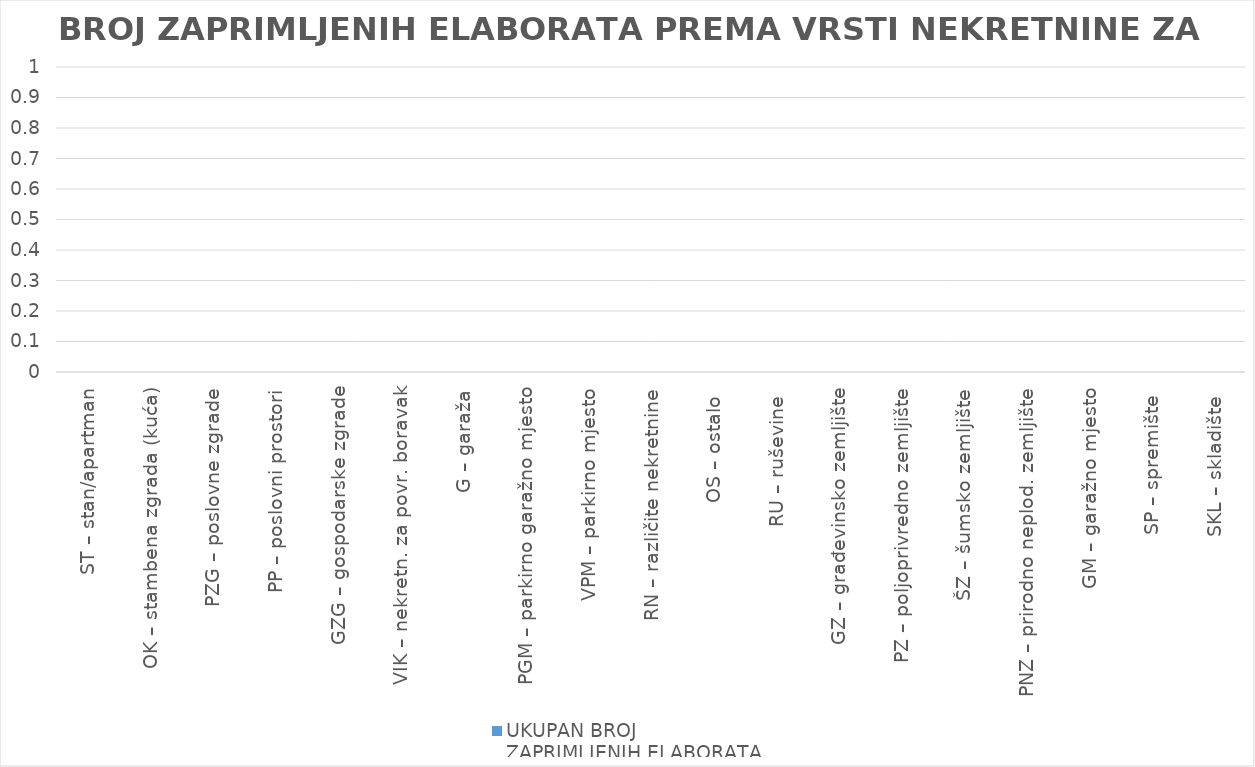
| Category | UKUPAN BROJ 
ZAPRIMLJENIH ELABORATA |
|---|---|
| ST – stan/apartman | 0 |
| OK – stambena zgrada (kuća) | 0 |
| PZG – poslovne zgrade | 0 |
| PP – poslovni prostori | 0 |
| GZG – gospodarske zgrade | 0 |
| VIK – nekretn. za povr. boravak | 0 |
| G – garaža | 0 |
| PGM – parkirno garažno mjesto | 0 |
| VPM – parkirno mjesto | 0 |
| RN – različite nekretnine | 0 |
| OS – ostalo  | 0 |
| RU – ruševine  | 0 |
| GZ – građevinsko zemljište | 0 |
| PZ – poljoprivredno zemljište | 0 |
| ŠZ – šumsko zemljište | 0 |
| PNZ – prirodno neplod. zemljište | 0 |
| GM – garažno mjesto | 0 |
| SP – spremište  | 0 |
| SKL – skladište  | 0 |